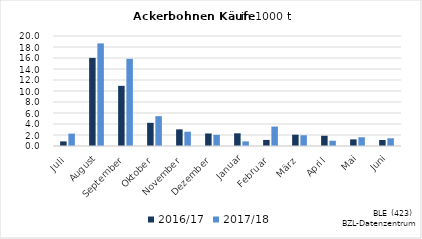
| Category | 2016/17 | 2017/18 |
|---|---|---|
| Juli | 0.836 | 2.25 |
| August | 16.018 | 18.658 |
| September | 10.938 | 15.849 |
| Oktober | 4.213 | 5.425 |
| November | 3.023 | 2.593 |
| Dezember | 2.277 | 2.031 |
| Januar | 2.305 | 0.836 |
| Februar | 1.104 | 3.534 |
| März | 2.056 | 1.954 |
| April | 1.861 | 0.955 |
| Mai | 1.203 | 1.591 |
| Juni | 1.087 | 1.405 |